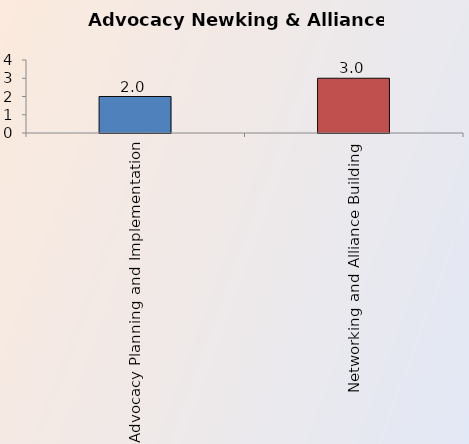
| Category | Series 0 |
|---|---|
| Advocacy Planning and Implementation | 2 |
| Networking and Alliance Building | 3 |